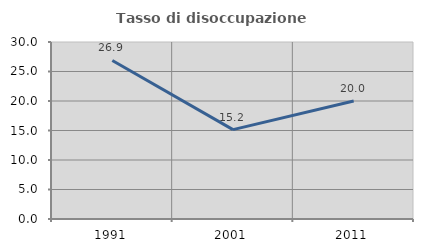
| Category | Tasso di disoccupazione giovanile  |
|---|---|
| 1991.0 | 26.866 |
| 2001.0 | 15.152 |
| 2011.0 | 20 |